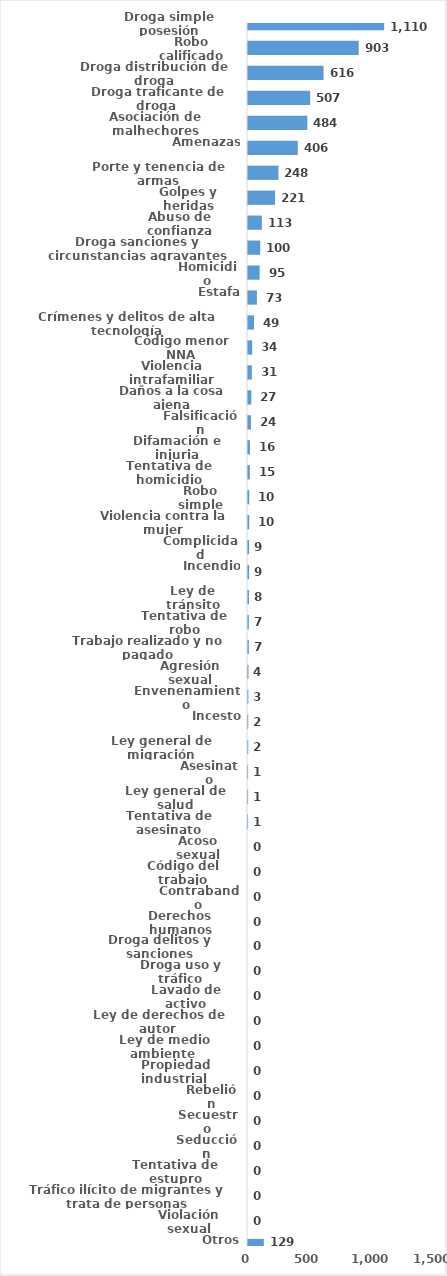
| Category | Series 0 |
|---|---|
| Droga simple posesión | 1110 |
| Robo calificado | 903 |
| Droga distribución de droga | 616 |
| Droga traficante de droga  | 507 |
| Asociación de malhechores | 484 |
| Amenazas | 406 |
| Porte y tenencia de armas | 248 |
| Golpes y heridas | 221 |
| Abuso de confianza | 113 |
| Droga sanciones y circunstancias agravantes | 100 |
| Homicidio | 95 |
| Estafa | 73 |
| Crímenes y delitos de alta tecnología | 49 |
| Código menor NNA | 34 |
| Violencia intrafamiliar | 31 |
| Daños a la cosa ajena | 27 |
| Falsificación | 24 |
| Difamación e injuria | 16 |
| Tentativa de homicidio | 15 |
| Robo simple | 10 |
| Violencia contra la mujer | 10 |
| Complicidad | 9 |
| Incendio | 9 |
| Ley de tránsito | 8 |
| Tentativa de robo | 7 |
| Trabajo realizado y no pagado | 7 |
| Agresión sexual | 4 |
| Envenenamiento | 3 |
| Incesto | 2 |
| Ley general de migración | 2 |
| Asesinato | 1 |
| Ley general de salud | 1 |
| Tentativa de asesinato | 1 |
| Acoso sexual | 0 |
| Código del trabajo | 0 |
| Contrabando | 0 |
| Derechos humanos | 0 |
| Droga delitos y sanciones | 0 |
| Droga uso y tráfico | 0 |
| Lavado de activo | 0 |
| Ley de derechos de autor  | 0 |
| Ley de medio ambiente  | 0 |
| Propiedad industrial  | 0 |
| Rebelión | 0 |
| Secuestro | 0 |
| Seducción | 0 |
| Tentativa de estupro | 0 |
| Tráfico ilícito de migrantes y trata de personas | 0 |
| Violación sexual | 0 |
| Otros | 129 |